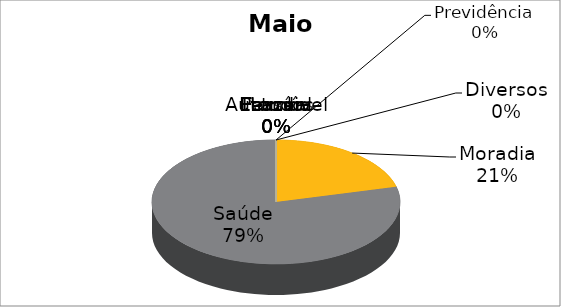
| Category | Maio | Janeiro |
|---|---|---|
| Moradia | 800 | 4020 |
| Saúde | 3000 | 100 |
| Estudos | 0 | 680 |
| Automóvel | 0 | 1230 |
| Pessoal | 0 | 640 |
| Lazer | 0 | 400 |
| Família | 0 | 700 |
| Previdência | 0 | 0 |
| Diversos | 0 | 0 |